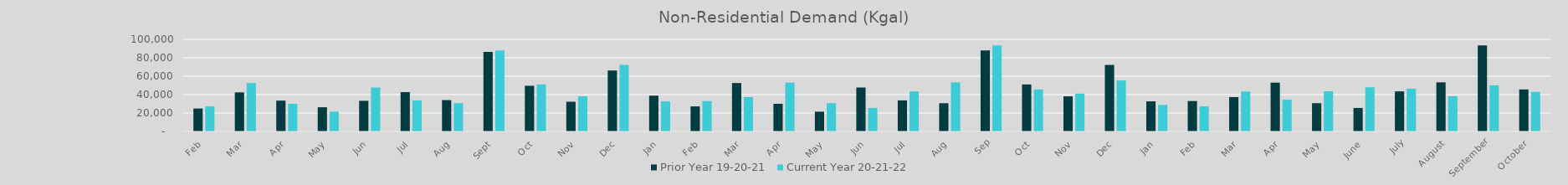
| Category | Prior Year 19-20-21 | Current Year 20-21-22 |
|---|---|---|
| Feb | 24891.705 | 27184.287 |
| Mar | 42416.796 | 52556.784 |
| Apr | 33427.881 | 30008.586 |
| May | 26254.448 | 21459.484 |
| Jun | 33248.873 | 47687.401 |
| Jul | 42679.938 | 33702.696 |
| Aug | 34036.498 | 30630.765 |
| Sep | 86367.775 | 87939.966 |
| Oct | 49561.754 | 51017.647 |
| Nov | 32261.42 | 38090.247 |
| Dec | 66164.871 | 72201.815 |
| Jan | 38851.995 | 32645.301 |
| Feb | 27184.287 | 32987.653 |
| Mar | 52556.784 | 37296.185 |
| Apr | 30008.586 | 52983.593 |
| May | 21459.484 | 30657.737 |
| Jun | 47687.401 | 25485.258 |
| Jul | 33702.696 | 43493.567 |
| Aug | 30630.765 | 53305.831 |
| Sep | 87939.966 | 93442.494 |
| Oct | 51017.647 | 45586.98 |
| Nov | 38090.247 | 41019.482 |
| Dec | 72201.815 | 55350.474 |
| Jan | 32645.301 | 28832.602 |
| Feb | 32987.653 | 27305.762 |
| Mar | 37296.185 | 43384.037 |
| Apr | 52983.593 | 34485.291 |
| May | 30657.737 | 43618.865 |
| June | 25485.258 | 47925.22 |
| July | 43493.567 | 46450.441 |
| August | 53305.831 | 38203.345 |
| September | 93442.494 | 50043.287 |
| October | 45586.98 | 42946.487 |